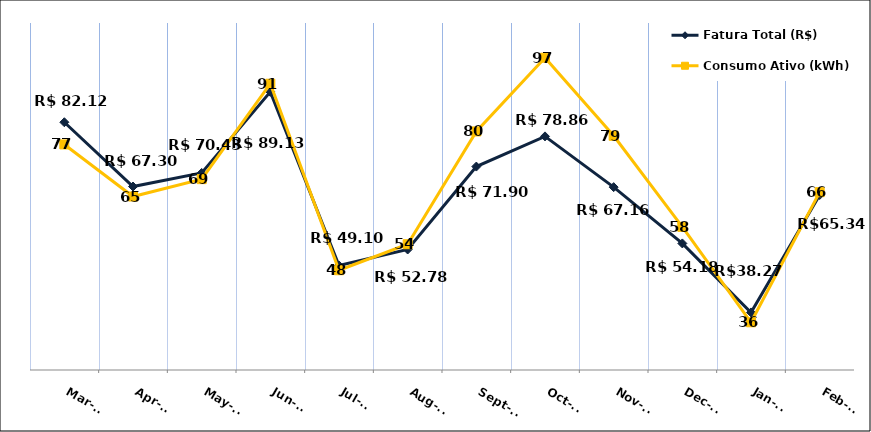
| Category | Fatura Total (R$) |
|---|---|
| 2022-03-01 | 82.12 |
| 2022-04-01 | 67.3 |
| 2022-05-01 | 70.43 |
| 2022-06-01 | 89.13 |
| 2022-07-01 | 49.1 |
| 2022-08-01 | 52.78 |
| 2022-09-01 | 71.9 |
| 2022-10-01 | 78.86 |
| 2022-11-01 | 67.16 |
| 2022-12-01 | 54.18 |
| 2023-01-01 | 38.27 |
| 2023-02-01 | 65.34 |